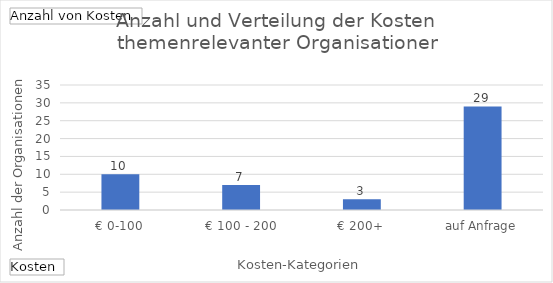
| Category | Ergebnis |
|---|---|
| € 0-100 | 10 |
| € 100 - 200 | 7 |
| € 200+ | 3 |
| auf Anfrage | 29 |